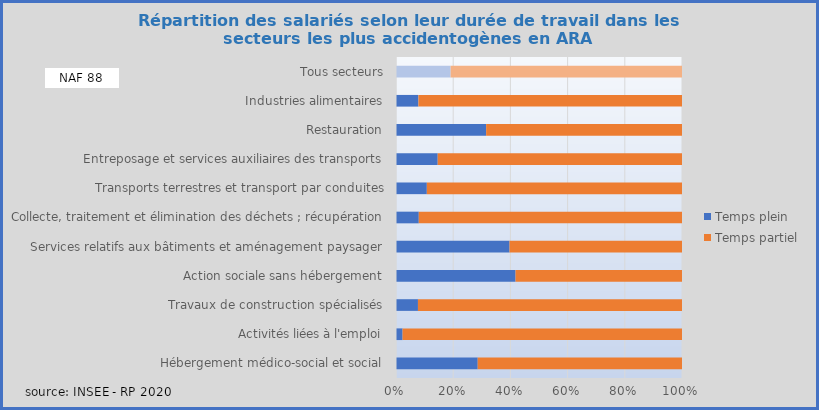
| Category | Temps plein | Temps partiel |
|---|---|---|
| Hébergement médico-social et social | 0.286 | 0.714 |
| Activités liées à l'emploi | 0.023 | 0.977 |
| Travaux de construction spécialisés | 0.077 | 0.923 |
| Action sociale sans hébergement | 0.418 | 0.582 |
| Services relatifs aux bâtiments et aménagement paysager | 0.397 | 0.603 |
| Collecte, traitement et élimination des déchets ; récupération | 0.08 | 0.92 |
| Transports terrestres et transport par conduites | 0.108 | 0.892 |
| Entreposage et services auxiliaires des transports | 0.146 | 0.854 |
| Restauration | 0.315 | 0.685 |
| Industries alimentaires | 0.078 | 0.922 |
| Tous secteurs | 0.191 | 0.809 |